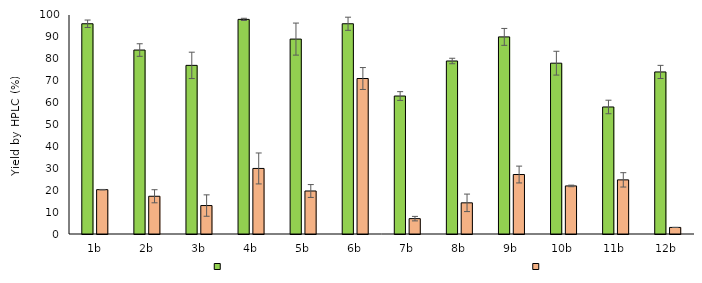
| Category | Series 0 | Series 2 |
|---|---|---|
| 1b | 96 | 20.245 |
| 2b | 84 | 17.235 |
| 3b | 77 | 12.992 |
| 4b | 98 | 29.933 |
| 5b | 89 | 19.637 |
| 6b | 96 | 71 |
| 7b | 63 | 7.015 |
| 8b | 79 | 14.228 |
| 9b | 90 | 27.157 |
| 10b | 78 | 21.95 |
| 11b | 58 | 24.721 |
| 12b | 74 | 3 |